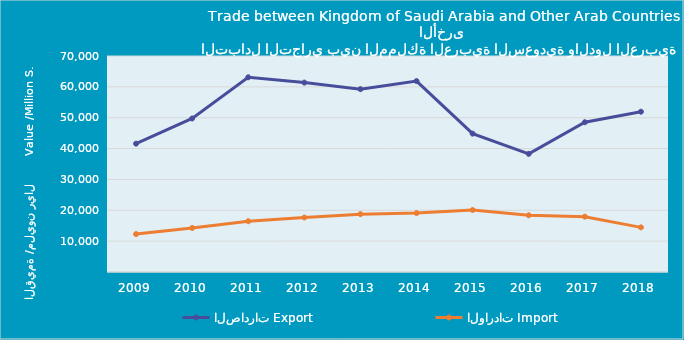
| Category | الصادرات | الواردات |
|---|---|---|
| 2009.0 | 41590220535 | 12285294800 |
| 2010.0 | 49753367748 | 14260554513 |
| 2011.0 | 63103139537 | 16451621185 |
| 2012.0 | 61379311755 | 17655230273 |
| 2013.0 | 59256557166 | 18737009100 |
| 2014.0 | 61874003822 | 19097745011 |
| 2015.0 | 44836217586 | 20094584079 |
| 2016.0 | 38290870481 | 18382534453 |
| 2017.0 | 48537273881 | 17933947092 |
| 2018.0 | 51945919770 | 14467589642 |